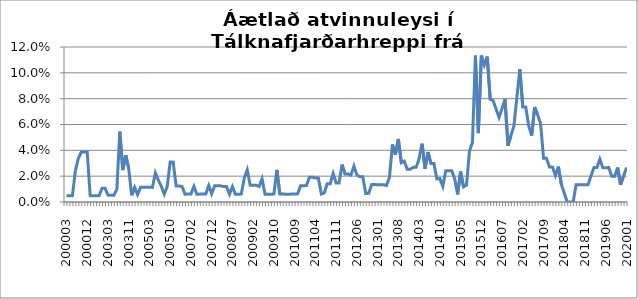
| Category | Series 0 |
|---|---|
| 200003 | 0.005 |
| 200004 | 0.005 |
| 200005 | 0.005 |
| 200008 | 0.024 |
| 200009 | 0.034 |
| 200010 | 0.039 |
| 200011 | 0.039 |
| 200012 | 0.039 |
| 200101 | 0.005 |
| 200112 | 0.005 |
| 200201 | 0.005 |
| 200202 | 0.005 |
| 200301 | 0.011 |
| 200302 | 0.011 |
| 200303 | 0.005 |
| 200304 | 0.005 |
| 200306 | 0.005 |
| 200307 | 0.01 |
| 200308 | 0.054 |
| 200309 | 0.025 |
| 200310 | 0.036 |
| 200311 | 0.026 |
| 200312 | 0.005 |
| 200407 | 0.011 |
| 200408 | 0.006 |
| 200409 | 0.011 |
| 200501 | 0.011 |
| 200502 | 0.011 |
| 200503 | 0.011 |
| 200504 | 0.011 |
| 200505 | 0.023 |
| 200506 | 0.017 |
| 200507 | 0.012 |
| 200508 | 0.006 |
| 200509 | 0.012 |
| 200510 | 0.031 |
| 200511 | 0.031 |
| 200512 | 0.012 |
| 200601 | 0.012 |
| 200607 | 0.012 |
| 200608 | 0.006 |
| 200701 | 0.006 |
| 200702 | 0.006 |
| 200705 | 0.012 |
| 200706 | 0.006 |
| 200707 | 0.006 |
| 200708 | 0.006 |
| 200709 | 0.006 |
| 200711 | 0.013 |
| 200712 | 0.006 |
| 200801 | 0.012 |
| 200802 | 0.012 |
| 200803 | 0.012 |
| 200804 | 0.012 |
| 200805 | 0.012 |
| 200806 | 0.006 |
| 200807 | 0.012 |
| 200808 | 0.006 |
| 200809 | 0.006 |
| 200810 | 0.006 |
| 200811 | 0.019 |
| 200812 | 0.025 |
| 200901 | 0.013 |
| 200902 | 0.013 |
| 200903 | 0.013 |
| 200904 | 0.012 |
| 200905 | 0.018 |
| 200906 | 0.006 |
| 200907 | 0.006 |
| 200909 | 0.006 |
| 200910 | 0.006 |
| 200911 | 0.025 |
| 200912 | 0.006 |
| 201001 | 0.006 |
| 201005 | 0.006 |
| 201006 | 0.006 |
| 201007 | 0.006 |
| 201009 | 0.006 |
| 201010 | 0.006 |
| 201011 | 0.013 |
| 201012 | 0.013 |
| 201101 | 0.013 |
| 201102 | 0.019 |
| 201103 | 0.019 |
| 201104 | 0.019 |
| 201105 | 0.019 |
| 201106 | 0.006 |
| 201107 | 0.007 |
| 201108 | 0.014 |
| 201109 | 0.014 |
| 201110 | 0.022 |
| 201111 | 0.015 |
| 201112 | 0.015 |
| 201201 | 0.029 |
| 201202 | 0.022 |
| 201203 | 0.022 |
| 201204 | 0.021 |
| 201205 | 0.028 |
| 201206 | 0.021 |
| 201207 | 0.02 |
| 201208 | 0.02 |
| 201209 | 0.007 |
| 201210 | 0.007 |
| 201211 | 0.014 |
| 201212 | 0.014 |
| 201301 | 0.013 |
| 201302 | 0.013 |
| 201303 | 0.013 |
| 201304 | 0.013 |
| 201305 | 0.019 |
| 201306 | 0.045 |
| 201307 | 0.037 |
| 201308 | 0.049 |
| 201309 | 0.03 |
| 201310 | 0.032 |
| 201311* | 0.025 |
| 201312 | 0.025 |
| 201401 | 0.027 |
| 201402 | 0.027 |
| 201403 | 0.034 |
| 201404 | 0.045 |
| 201405 | 0.026 |
| 201406 | 0.039 |
| 201407 | 0.03 |
| 201408 | 0.03 |
| 201409 | 0.018 |
| 201410 | 0.018 |
| 201411 | 0.012 |
| 201412 | 0.024 |
| 201501 | 0.024 |
| 201502 | 0.024 |
| 201503 | 0.018 |
| 201504 | 0.006 |
| 201505 | 0.024 |
| 201506 | 0.012 |
| 201507 | 0.013 |
| 201508 | 0.039 |
| 201509 | 0.046 |
| 201510 | 0.113 |
| 201511 | 0.053 |
| 201512 | 0.113 |
| 201601 | 0.106 |
| 201602 | 0.113 |
| 201603 | 0.079 |
| 201604 | 0.078 |
| 201605 | 0.072 |
| 201606 | 0.065 |
| 201607 | 0.072 |
| 201608 | 0.08 |
| 201609 | 0.043 |
| 201610 | 0.051 |
| 201611 | 0.059 |
| 201612 | 0.081 |
| 201701 | 0.103 |
| 201702 | 0.074 |
| 201703 | 0.074 |
| 201704 | 0.059 |
| 201705 | 0.051 |
| 201706 | 0.074 |
| 201707 | 0.068 |
| 201708 | 0.061 |
| 201709 | 0.034 |
| 201710 | 0.034 |
| 201711 | 0.027 |
| 201712 | 0.027 |
| 201801 | 0.021 |
| 201802 | 0.027 |
| 201803 | 0.014 |
| 201804 | 0.007 |
| 201805 | 0 |
| 201806 | 0 |
| 201807 | 0 |
| 201808 | 0.013 |
| 201809 | 0.013 |
| 201810 | 0.013 |
| 201811 | 0.013 |
| 201812 | 0.013 |
| 201901 | 0.02 |
| 201902 | 0.027 |
| 201903 | 0.027 |
| 201904 | 0.033 |
| 201905 | 0.026 |
| 201906 | 0.026 |
| 201907 | 0.027 |
| 201908 | 0.02 |
| 201909 | 0.02 |
| 201910 | 0.027 |
| 201911 | 0.013 |
| 201912 | 0.02 |
| 202001 | 0.027 |